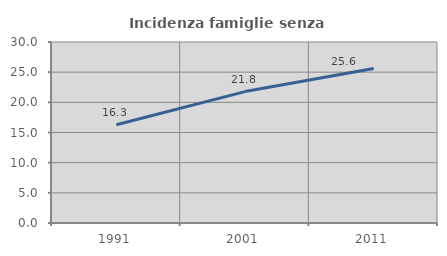
| Category | Incidenza famiglie senza nuclei |
|---|---|
| 1991.0 | 16.294 |
| 2001.0 | 21.781 |
| 2011.0 | 25.607 |